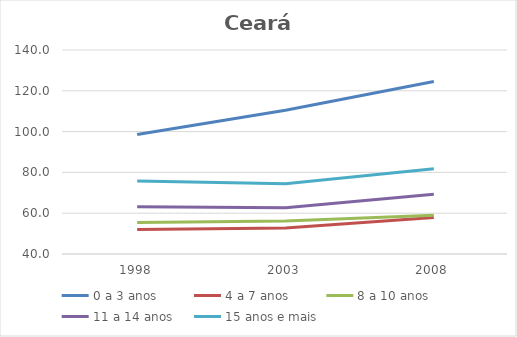
| Category | 0 a 3 anos | 4 a 7 anos | 8 a 10 anos | 11 a 14 anos | 15 anos e mais |
|---|---|---|---|---|---|
| 1998.0 | 98.6 | 52 | 55.4 | 63.2 | 75.8 |
| 2003.0 | 110.5 | 52.8 | 56.2 | 62.7 | 74.4 |
| 2008.0 | 124.6 | 57.9 | 59 | 69.3 | 81.8 |